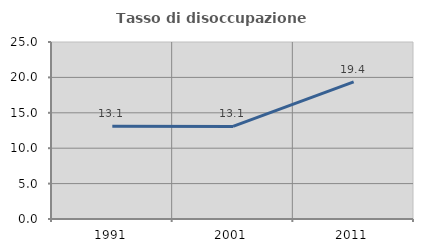
| Category | Tasso di disoccupazione giovanile  |
|---|---|
| 1991.0 | 13.103 |
| 2001.0 | 13.077 |
| 2011.0 | 19.38 |